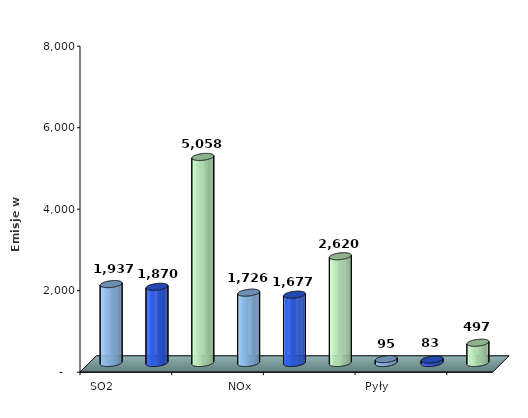
| Category | Series 0 |
|---|---|
| SO2 | 1937 |
|  | 1870.31 |
|  | 5057.77 |
| NOx | 1726 |
|  | 1677 |
|  | 2620.27 |
| Pyły | 95 |